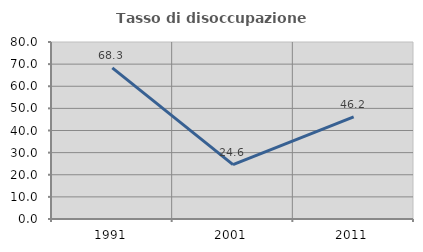
| Category | Tasso di disoccupazione giovanile  |
|---|---|
| 1991.0 | 68.269 |
| 2001.0 | 24.561 |
| 2011.0 | 46.154 |